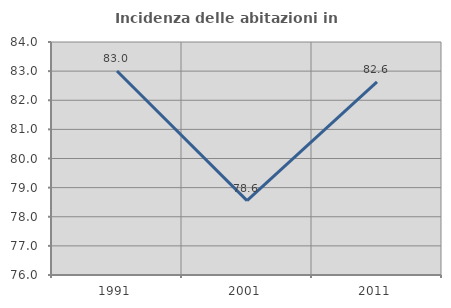
| Category | Incidenza delle abitazioni in proprietà  |
|---|---|
| 1991.0 | 83.005 |
| 2001.0 | 78.555 |
| 2011.0 | 82.629 |